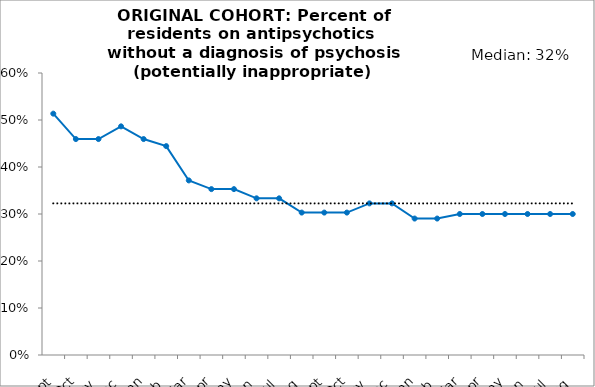
| Category | Potentially inappropriate | Median |
|---|---|---|
| 2015-09-01 | 0.514 | 0.323 |
| 2015-10-01 | 0.459 | 0.323 |
| 2015-11-01 | 0.459 | 0.323 |
| 2015-12-01 | 0.486 | 0.323 |
| 2016-01-01 | 0.459 | 0.323 |
| 2016-02-01 | 0.444 | 0.323 |
| 2016-03-01 | 0.371 | 0.323 |
| 2016-04-01 | 0.353 | 0.323 |
| 2016-05-01 | 0.353 | 0.323 |
| 2016-06-01 | 0.333 | 0.323 |
| 2016-07-01 | 0.333 | 0.323 |
| 2016-08-01 | 0.303 | 0.323 |
| 2016-09-01 | 0.303 | 0.323 |
| 2016-10-01 | 0.303 | 0.323 |
| 2016-11-01 | 0.323 | 0.323 |
| 2016-12-01 | 0.323 | 0.323 |
| 2017-01-01 | 0.29 | 0.323 |
| 2017-02-01 | 0.29 | 0.323 |
| 2017-03-01 | 0.3 | 0.323 |
| 2017-04-01 | 0.3 | 0.323 |
| 2017-05-01 | 0.3 | 0.323 |
| 2017-06-01 | 0.3 | 0.323 |
| 2017-07-01 | 0.3 | 0.323 |
| 2017-08-01 | 0.3 | 0.323 |